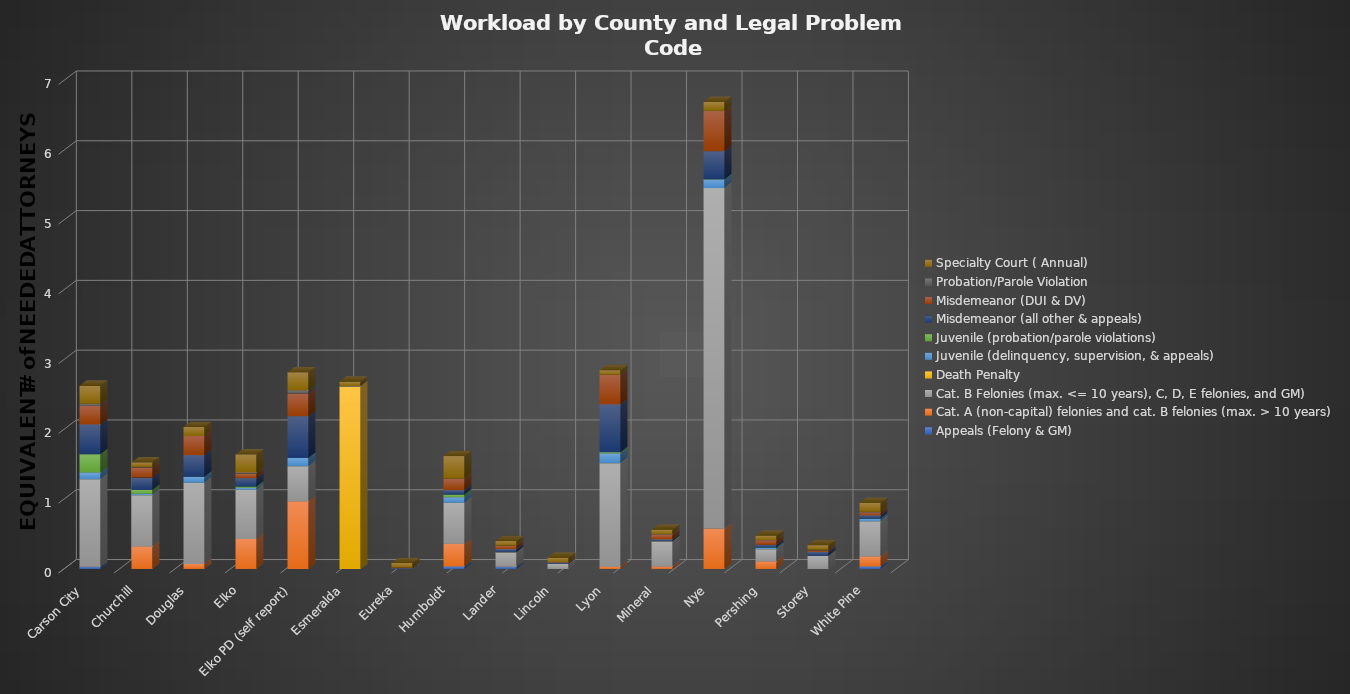
| Category | Appeals (Felony & GM) | Cat. A (non-capital) felonies and cat. B felonies (max. > 10 years) | Cat. B Felonies (max. <= 10 years), C, D, E felonies, and GM) | Death Penalty | Juvenile (delinquency, supervision, & appeals) | Juvenile (probation/parole violations) | Misdemeanor (all other & appeals) | Misdemeanor (DUI & DV) | Probation/Parole Violation | Specialty Court ( Annual) |
|---|---|---|---|---|---|---|---|---|---|---|
| Carson City | 0.036 | 0 | 1.249 | 0 | 0.097 | 0.261 | 0.427 | 0.266 | 0.032 | 0.259 |
| Churchill | 0 | 0.323 | 0.732 | 0 | 0.022 | 0.056 | 0.177 | 0.144 | 0.009 | 0.065 |
| Douglas | 0 | 0.072 | 1.163 | 0 | 0.086 | 0 | 0.31 | 0.273 | 0 | 0.129 |
| Elko | 0 | 0.431 | 0.704 | 0 | 0.027 | 0.019 | 0.121 | 0.065 | 0.017 | 0.259 |
| Elko PD (self report) | 0 | 0.969 | 0.503 | 0 | 0.118 | 0 | 0.599 | 0.323 | 0.046 | 0.259 |
| Esmeralda | 0 | 0 | 0 | 2.619 | 0 | 0 | 0 | 0 | 0 | 0.065 |
| Eureka | 0 | 0 | 0 | 0 | 0 | 0 | 0.013 | 0.007 | 0 | 0.065 |
| Humboldt | 0.036 | 0.323 | 0.589 | 0 | 0.081 | 0.037 | 0.065 | 0.158 | 0.006 | 0.323 |
| Lander | 0.036 | 0 | 0.201 | 0 | 0 | 0 | 0.047 | 0.05 | 0 | 0.065 |
| Lincoln | 0 | 0 | 0.072 | 0 | 0 | 0 | 0.017 | 0.007 | 0 | 0.065 |
| Lyon | 0 | 0.036 | 1.479 | 0 | 0.14 | 0.019 | 0.685 | 0.424 | 0 | 0.065 |
| Mineral | 0 | 0.036 | 0.359 | 0 | 0 | 0 | 0.03 | 0.065 | 0.009 | 0.065 |
| Nye | 0 | 0.574 | 4.883 | 0 | 0.124 | 0 | 0.405 | 0.574 | 0.003 | 0.129 |
| Pershing | 0 | 0.108 | 0.172 | 0 | 0.027 | 0 | 0.039 | 0.065 | 0.003 | 0.065 |
| Storey | 0 | 0 | 0.187 | 0 | 0 | 0 | 0.056 | 0.022 | 0.011 | 0.065 |
| White Pine | 0.036 | 0.144 | 0.503 | 0 | 0.038 | 0 | 0.047 | 0.043 | 0.009 | 0.129 |